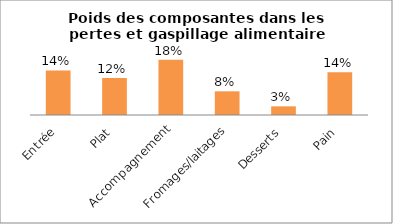
| Category | Series 0 | Series 1 | Series 2 |
|---|---|---|---|
| Entrée |  |  | 0.141 |
| Plat |  |  | 0.117 |
| Accompagnement |  |  | 0.175 |
| Fromages/laitages |  |  | 0.075 |
| Desserts |  |  | 0.027 |
| Pain |  |  | 0.135 |